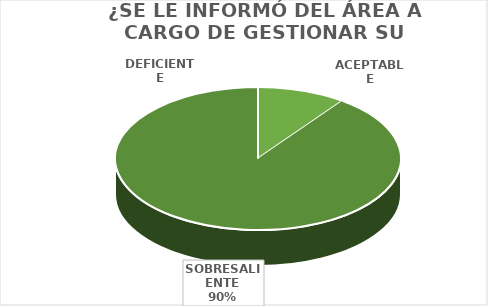
| Category | Series 0 |
|---|---|
| DEFICIENTE | 0 |
| ACEPTABLE | 21 |
| SOBRESALIENTE | 188 |